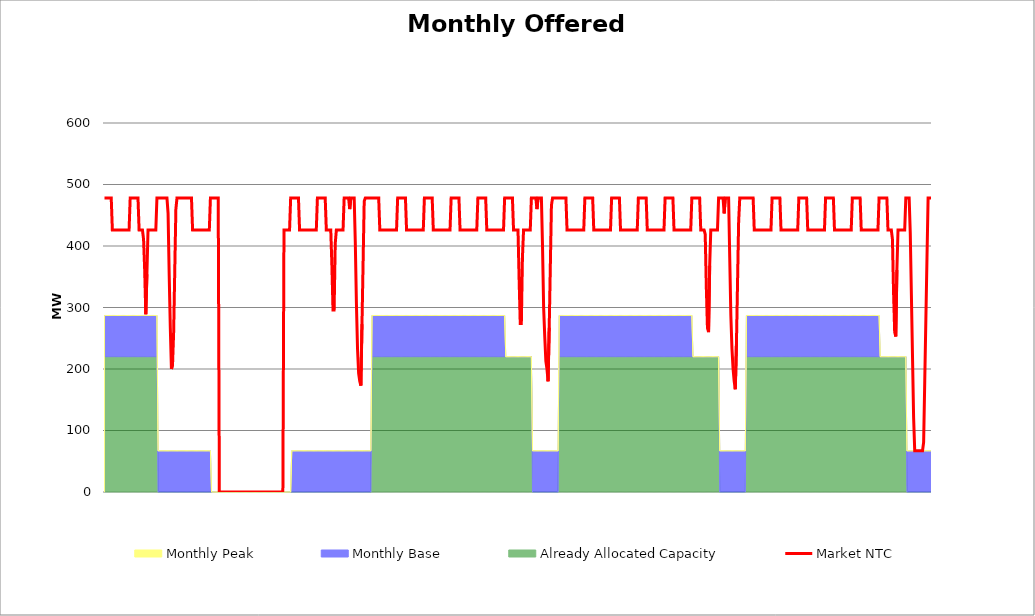
| Category | Market NTC |
|---|---|
| 0 | 478 |
| 1 | 478 |
| 2 | 478 |
| 3 | 478 |
| 4 | 478 |
| 5 | 478 |
| 6 | 478 |
| 7 | 426 |
| 8 | 426 |
| 9 | 426 |
| 10 | 426 |
| 11 | 426 |
| 12 | 426 |
| 13 | 426 |
| 14 | 426 |
| 15 | 426 |
| 16 | 426 |
| 17 | 426 |
| 18 | 426 |
| 19 | 426 |
| 20 | 426 |
| 21 | 426 |
| 22 | 426 |
| 23 | 478 |
| 24 | 478 |
| 25 | 478 |
| 26 | 478 |
| 27 | 478 |
| 28 | 478 |
| 29 | 478 |
| 30 | 478 |
| 31 | 426 |
| 32 | 426 |
| 33 | 426 |
| 34 | 426 |
| 35 | 411 |
| 36 | 361 |
| 37 | 289 |
| 38 | 354 |
| 39 | 426 |
| 40 | 426 |
| 41 | 426 |
| 42 | 426 |
| 43 | 426 |
| 44 | 426 |
| 45 | 426 |
| 46 | 426 |
| 47 | 478 |
| 48 | 478 |
| 49 | 478 |
| 50 | 478 |
| 51 | 478 |
| 52 | 478 |
| 53 | 478 |
| 54 | 478 |
| 55 | 478 |
| 56 | 478 |
| 57 | 453 |
| 58 | 353 |
| 59 | 267 |
| 60 | 200 |
| 61 | 207 |
| 62 | 260 |
| 63 | 360 |
| 64 | 460 |
| 65 | 478 |
| 66 | 478 |
| 67 | 478 |
| 68 | 478 |
| 69 | 478 |
| 70 | 478 |
| 71 | 478 |
| 72 | 478 |
| 73 | 478 |
| 74 | 478 |
| 75 | 478 |
| 76 | 478 |
| 77 | 478 |
| 78 | 478 |
| 79 | 426 |
| 80 | 426 |
| 81 | 426 |
| 82 | 426 |
| 83 | 426 |
| 84 | 426 |
| 85 | 426 |
| 86 | 426 |
| 87 | 426 |
| 88 | 426 |
| 89 | 426 |
| 90 | 426 |
| 91 | 426 |
| 92 | 426 |
| 93 | 426 |
| 94 | 426 |
| 95 | 478 |
| 96 | 478 |
| 97 | 478 |
| 98 | 478 |
| 99 | 478 |
| 100 | 478 |
| 101 | 478 |
| 102 | 478 |
| 103 | 0 |
| 104 | 0 |
| 105 | 0 |
| 106 | 0 |
| 107 | 0 |
| 108 | 0 |
| 109 | 0 |
| 110 | 0 |
| 111 | 0 |
| 112 | 0 |
| 113 | 0 |
| 114 | 0 |
| 115 | 0 |
| 116 | 0 |
| 117 | 0 |
| 118 | 0 |
| 119 | 0 |
| 120 | 0 |
| 121 | 0 |
| 122 | 0 |
| 123 | 0 |
| 124 | 0 |
| 125 | 0 |
| 126 | 0 |
| 127 | 0 |
| 128 | 0 |
| 129 | 0 |
| 130 | 0 |
| 131 | 0 |
| 132 | 0 |
| 133 | 0 |
| 134 | 0 |
| 135 | 0 |
| 136 | 0 |
| 137 | 0 |
| 138 | 0 |
| 139 | 0 |
| 140 | 0 |
| 141 | 0 |
| 142 | 0 |
| 143 | 0 |
| 144 | 0 |
| 145 | 0 |
| 146 | 0 |
| 147 | 0 |
| 148 | 0 |
| 149 | 0 |
| 150 | 0 |
| 151 | 0 |
| 152 | 0 |
| 153 | 0 |
| 154 | 0 |
| 155 | 0 |
| 156 | 0 |
| 157 | 0 |
| 158 | 0 |
| 159 | 0 |
| 160 | 0 |
| 161 | 426 |
| 162 | 426 |
| 163 | 426 |
| 164 | 426 |
| 165 | 426 |
| 166 | 426 |
| 167 | 478 |
| 168 | 478 |
| 169 | 478 |
| 170 | 478 |
| 171 | 478 |
| 172 | 478 |
| 173 | 478 |
| 174 | 478 |
| 175 | 426 |
| 176 | 426 |
| 177 | 426 |
| 178 | 426 |
| 179 | 426 |
| 180 | 426 |
| 181 | 426 |
| 182 | 426 |
| 183 | 426 |
| 184 | 426 |
| 185 | 426 |
| 186 | 426 |
| 187 | 426 |
| 188 | 426 |
| 189 | 426 |
| 190 | 426 |
| 191 | 478 |
| 192 | 478 |
| 193 | 478 |
| 194 | 478 |
| 195 | 478 |
| 196 | 478 |
| 197 | 478 |
| 198 | 478 |
| 199 | 426 |
| 200 | 426 |
| 201 | 426 |
| 202 | 426 |
| 203 | 426 |
| 204 | 368 |
| 205 | 296 |
| 206 | 296 |
| 207 | 404 |
| 208 | 426 |
| 209 | 426 |
| 210 | 426 |
| 211 | 426 |
| 212 | 426 |
| 213 | 426 |
| 214 | 426 |
| 215 | 478 |
| 216 | 478 |
| 217 | 478 |
| 218 | 478 |
| 219 | 478 |
| 220 | 460 |
| 221 | 478 |
| 222 | 478 |
| 223 | 478 |
| 224 | 478 |
| 225 | 406 |
| 226 | 307 |
| 227 | 233 |
| 228 | 193 |
| 229 | 180 |
| 230 | 173 |
| 231 | 273 |
| 232 | 373 |
| 233 | 473 |
| 234 | 478 |
| 235 | 478 |
| 236 | 478 |
| 237 | 478 |
| 238 | 478 |
| 239 | 478 |
| 240 | 478 |
| 241 | 478 |
| 242 | 478 |
| 243 | 478 |
| 244 | 478 |
| 245 | 478 |
| 246 | 478 |
| 247 | 426 |
| 248 | 426 |
| 249 | 426 |
| 250 | 426 |
| 251 | 426 |
| 252 | 426 |
| 253 | 426 |
| 254 | 426 |
| 255 | 426 |
| 256 | 426 |
| 257 | 426 |
| 258 | 426 |
| 259 | 426 |
| 260 | 426 |
| 261 | 426 |
| 262 | 426 |
| 263 | 478 |
| 264 | 478 |
| 265 | 478 |
| 266 | 478 |
| 267 | 478 |
| 268 | 478 |
| 269 | 478 |
| 270 | 478 |
| 271 | 426 |
| 272 | 426 |
| 273 | 426 |
| 274 | 426 |
| 275 | 426 |
| 276 | 426 |
| 277 | 426 |
| 278 | 426 |
| 279 | 426 |
| 280 | 426 |
| 281 | 426 |
| 282 | 426 |
| 283 | 426 |
| 284 | 426 |
| 285 | 426 |
| 286 | 426 |
| 287 | 478 |
| 288 | 478 |
| 289 | 478 |
| 290 | 478 |
| 291 | 478 |
| 292 | 478 |
| 293 | 478 |
| 294 | 478 |
| 295 | 426 |
| 296 | 426 |
| 297 | 426 |
| 298 | 426 |
| 299 | 426 |
| 300 | 426 |
| 301 | 426 |
| 302 | 426 |
| 303 | 426 |
| 304 | 426 |
| 305 | 426 |
| 306 | 426 |
| 307 | 426 |
| 308 | 426 |
| 309 | 426 |
| 310 | 426 |
| 311 | 478 |
| 312 | 478 |
| 313 | 478 |
| 314 | 478 |
| 315 | 478 |
| 316 | 478 |
| 317 | 478 |
| 318 | 478 |
| 319 | 426 |
| 320 | 426 |
| 321 | 426 |
| 322 | 426 |
| 323 | 426 |
| 324 | 426 |
| 325 | 426 |
| 326 | 426 |
| 327 | 426 |
| 328 | 426 |
| 329 | 426 |
| 330 | 426 |
| 331 | 426 |
| 332 | 426 |
| 333 | 426 |
| 334 | 426 |
| 335 | 478 |
| 336 | 478 |
| 337 | 478 |
| 338 | 478 |
| 339 | 478 |
| 340 | 478 |
| 341 | 478 |
| 342 | 478 |
| 343 | 426 |
| 344 | 426 |
| 345 | 426 |
| 346 | 426 |
| 347 | 426 |
| 348 | 426 |
| 349 | 426 |
| 350 | 426 |
| 351 | 426 |
| 352 | 426 |
| 353 | 426 |
| 354 | 426 |
| 355 | 426 |
| 356 | 426 |
| 357 | 426 |
| 358 | 426 |
| 359 | 478 |
| 360 | 478 |
| 361 | 478 |
| 362 | 478 |
| 363 | 478 |
| 364 | 478 |
| 365 | 478 |
| 366 | 478 |
| 367 | 426 |
| 368 | 426 |
| 369 | 426 |
| 370 | 426 |
| 371 | 426 |
| 372 | 346 |
| 373 | 274 |
| 374 | 274 |
| 375 | 382 |
| 376 | 426 |
| 377 | 426 |
| 378 | 426 |
| 379 | 426 |
| 380 | 426 |
| 381 | 426 |
| 382 | 426 |
| 383 | 478 |
| 384 | 478 |
| 385 | 478 |
| 386 | 478 |
| 387 | 478 |
| 388 | 460 |
| 389 | 478 |
| 390 | 478 |
| 391 | 478 |
| 392 | 478 |
| 393 | 400 |
| 394 | 300 |
| 395 | 253 |
| 396 | 213 |
| 397 | 200 |
| 398 | 180 |
| 399 | 267 |
| 400 | 366 |
| 401 | 466 |
| 402 | 478 |
| 403 | 478 |
| 404 | 478 |
| 405 | 478 |
| 406 | 478 |
| 407 | 478 |
| 408 | 478 |
| 409 | 478 |
| 410 | 478 |
| 411 | 478 |
| 412 | 478 |
| 413 | 478 |
| 414 | 478 |
| 415 | 426 |
| 416 | 426 |
| 417 | 426 |
| 418 | 426 |
| 419 | 426 |
| 420 | 426 |
| 421 | 426 |
| 422 | 426 |
| 423 | 426 |
| 424 | 426 |
| 425 | 426 |
| 426 | 426 |
| 427 | 426 |
| 428 | 426 |
| 429 | 426 |
| 430 | 426 |
| 431 | 478 |
| 432 | 478 |
| 433 | 478 |
| 434 | 478 |
| 435 | 478 |
| 436 | 478 |
| 437 | 478 |
| 438 | 478 |
| 439 | 426 |
| 440 | 426 |
| 441 | 426 |
| 442 | 426 |
| 443 | 426 |
| 444 | 426 |
| 445 | 426 |
| 446 | 426 |
| 447 | 426 |
| 448 | 426 |
| 449 | 426 |
| 450 | 426 |
| 451 | 426 |
| 452 | 426 |
| 453 | 426 |
| 454 | 426 |
| 455 | 478 |
| 456 | 478 |
| 457 | 478 |
| 458 | 478 |
| 459 | 478 |
| 460 | 478 |
| 461 | 478 |
| 462 | 478 |
| 463 | 426 |
| 464 | 426 |
| 465 | 426 |
| 466 | 426 |
| 467 | 426 |
| 468 | 426 |
| 469 | 426 |
| 470 | 426 |
| 471 | 426 |
| 472 | 426 |
| 473 | 426 |
| 474 | 426 |
| 475 | 426 |
| 476 | 426 |
| 477 | 426 |
| 478 | 426 |
| 479 | 478 |
| 480 | 478 |
| 481 | 478 |
| 482 | 478 |
| 483 | 478 |
| 484 | 478 |
| 485 | 478 |
| 486 | 478 |
| 487 | 426 |
| 488 | 426 |
| 489 | 426 |
| 490 | 426 |
| 491 | 426 |
| 492 | 426 |
| 493 | 426 |
| 494 | 426 |
| 495 | 426 |
| 496 | 426 |
| 497 | 426 |
| 498 | 426 |
| 499 | 426 |
| 500 | 426 |
| 501 | 426 |
| 502 | 426 |
| 503 | 478 |
| 504 | 478 |
| 505 | 478 |
| 506 | 478 |
| 507 | 478 |
| 508 | 478 |
| 509 | 478 |
| 510 | 478 |
| 511 | 426 |
| 512 | 426 |
| 513 | 426 |
| 514 | 426 |
| 515 | 426 |
| 516 | 426 |
| 517 | 426 |
| 518 | 426 |
| 519 | 426 |
| 520 | 426 |
| 521 | 426 |
| 522 | 426 |
| 523 | 426 |
| 524 | 426 |
| 525 | 426 |
| 526 | 426 |
| 527 | 478 |
| 528 | 478 |
| 529 | 478 |
| 530 | 478 |
| 531 | 478 |
| 532 | 478 |
| 533 | 478 |
| 534 | 478 |
| 535 | 426 |
| 536 | 426 |
| 537 | 426 |
| 538 | 426 |
| 539 | 419 |
| 540 | 332 |
| 541 | 267 |
| 542 | 260 |
| 543 | 368 |
| 544 | 426 |
| 545 | 426 |
| 546 | 426 |
| 547 | 426 |
| 548 | 426 |
| 549 | 426 |
| 550 | 426 |
| 551 | 478 |
| 552 | 478 |
| 553 | 478 |
| 554 | 478 |
| 555 | 478 |
| 556 | 453 |
| 557 | 478 |
| 558 | 478 |
| 559 | 478 |
| 560 | 478 |
| 561 | 380 |
| 562 | 287 |
| 563 | 233 |
| 564 | 200 |
| 565 | 180 |
| 566 | 167 |
| 567 | 240 |
| 568 | 340 |
| 569 | 440 |
| 570 | 478 |
| 571 | 478 |
| 572 | 478 |
| 573 | 478 |
| 574 | 478 |
| 575 | 478 |
| 576 | 478 |
| 577 | 478 |
| 578 | 478 |
| 579 | 478 |
| 580 | 478 |
| 581 | 478 |
| 582 | 478 |
| 583 | 426 |
| 584 | 426 |
| 585 | 426 |
| 586 | 426 |
| 587 | 426 |
| 588 | 426 |
| 589 | 426 |
| 590 | 426 |
| 591 | 426 |
| 592 | 426 |
| 593 | 426 |
| 594 | 426 |
| 595 | 426 |
| 596 | 426 |
| 597 | 426 |
| 598 | 426 |
| 599 | 478 |
| 600 | 478 |
| 601 | 478 |
| 602 | 478 |
| 603 | 478 |
| 604 | 478 |
| 605 | 478 |
| 606 | 478 |
| 607 | 426 |
| 608 | 426 |
| 609 | 426 |
| 610 | 426 |
| 611 | 426 |
| 612 | 426 |
| 613 | 426 |
| 614 | 426 |
| 615 | 426 |
| 616 | 426 |
| 617 | 426 |
| 618 | 426 |
| 619 | 426 |
| 620 | 426 |
| 621 | 426 |
| 622 | 426 |
| 623 | 478 |
| 624 | 478 |
| 625 | 478 |
| 626 | 478 |
| 627 | 478 |
| 628 | 478 |
| 629 | 478 |
| 630 | 478 |
| 631 | 426 |
| 632 | 426 |
| 633 | 426 |
| 634 | 426 |
| 635 | 426 |
| 636 | 426 |
| 637 | 426 |
| 638 | 426 |
| 639 | 426 |
| 640 | 426 |
| 641 | 426 |
| 642 | 426 |
| 643 | 426 |
| 644 | 426 |
| 645 | 426 |
| 646 | 426 |
| 647 | 478 |
| 648 | 478 |
| 649 | 478 |
| 650 | 478 |
| 651 | 478 |
| 652 | 478 |
| 653 | 478 |
| 654 | 478 |
| 655 | 426 |
| 656 | 426 |
| 657 | 426 |
| 658 | 426 |
| 659 | 426 |
| 660 | 426 |
| 661 | 426 |
| 662 | 426 |
| 663 | 426 |
| 664 | 426 |
| 665 | 426 |
| 666 | 426 |
| 667 | 426 |
| 668 | 426 |
| 669 | 426 |
| 670 | 426 |
| 671 | 478 |
| 672 | 478 |
| 673 | 478 |
| 674 | 478 |
| 675 | 478 |
| 676 | 478 |
| 677 | 478 |
| 678 | 478 |
| 679 | 426 |
| 680 | 426 |
| 681 | 426 |
| 682 | 426 |
| 683 | 426 |
| 684 | 426 |
| 685 | 426 |
| 686 | 426 |
| 687 | 426 |
| 688 | 426 |
| 689 | 426 |
| 690 | 426 |
| 691 | 426 |
| 692 | 426 |
| 693 | 426 |
| 694 | 426 |
| 695 | 478 |
| 696 | 478 |
| 697 | 478 |
| 698 | 478 |
| 699 | 478 |
| 700 | 478 |
| 701 | 478 |
| 702 | 478 |
| 703 | 426 |
| 704 | 426 |
| 705 | 426 |
| 706 | 426 |
| 707 | 411 |
| 708 | 325 |
| 709 | 260 |
| 710 | 253 |
| 711 | 361 |
| 712 | 426 |
| 713 | 426 |
| 714 | 426 |
| 715 | 426 |
| 716 | 426 |
| 717 | 426 |
| 718 | 426 |
| 719 | 478 |
| 720 | 478 |
| 721 | 478 |
| 722 | 478 |
| 723 | 421 |
| 724 | 321 |
| 725 | 221 |
| 726 | 121 |
| 727 | 67 |
| 728 | 67 |
| 729 | 67 |
| 730 | 67 |
| 731 | 67 |
| 732 | 67 |
| 733 | 67 |
| 734 | 67 |
| 735 | 81 |
| 736 | 181 |
| 737 | 281 |
| 738 | 381 |
| 739 | 478 |
| 740 | 478 |
| 741 | 478 |
| 742 | 478 |